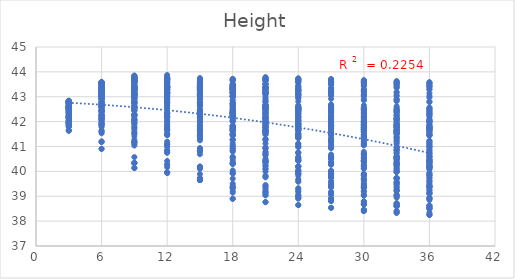
| Category | UTCI |
|---|---|
| 3.0 | 41.801 |
| 3.0 | 42.354 |
| 3.0 | 42.436 |
| 3.0 | 42.552 |
| 3.0 | 42.621 |
| 3.0 | 42.715 |
| 3.0 | 42.77 |
| 3.0 | 42.775 |
| 3.0 | 42.787 |
| 3.0 | 42.786 |
| 3.0 | 42.8 |
| 6.0 | 40.906 |
| 6.0 | 41.915 |
| 6.0 | 42.115 |
| 6.0 | 42.474 |
| 6.0 | 42.911 |
| 6.0 | 43.022 |
| 6.0 | 43.104 |
| 6.0 | 43.135 |
| 6.0 | 43.232 |
| 6.0 | 43.233 |
| 6.0 | 43.259 |
| 9.0 | 40.328 |
| 9.0 | 41.163 |
| 9.0 | 41.752 |
| 9.0 | 42.249 |
| 9.0 | 42.954 |
| 9.0 | 43.087 |
| 9.0 | 43.181 |
| 9.0 | 43.562 |
| 9.0 | 43.586 |
| 9.0 | 43.605 |
| 9.0 | 43.638 |
| 12.0 | 39.941 |
| 12.0 | 40.753 |
| 12.0 | 41.462 |
| 12.0 | 41.677 |
| 12.0 | 42.173 |
| 12.0 | 42.326 |
| 12.0 | 42.743 |
| 12.0 | 43.111 |
| 12.0 | 43.162 |
| 12.0 | 43.194 |
| 12.0 | 43.397 |
| 15.0 | 39.65 |
| 15.0 | 40.148 |
| 15.0 | 40.839 |
| 15.0 | 41.442 |
| 15.0 | 41.636 |
| 15.0 | 41.829 |
| 15.0 | 42.291 |
| 15.0 | 42.379 |
| 15.0 | 42.444 |
| 15.0 | 42.779 |
| 15.0 | 43.118 |
| 18.0 | 38.899 |
| 18.0 | 39.919 |
| 18.0 | 40.321 |
| 18.0 | 40.58 |
| 18.0 | 41.447 |
| 18.0 | 41.664 |
| 18.0 | 41.808 |
| 18.0 | 42.223 |
| 18.0 | 42.318 |
| 18.0 | 42.383 |
| 18.0 | 42.71 |
| 21.0 | 38.765 |
| 21.0 | 39.451 |
| 21.0 | 40.1 |
| 21.0 | 40.396 |
| 21.0 | 41.278 |
| 21.0 | 41.495 |
| 21.0 | 41.667 |
| 21.0 | 41.762 |
| 21.0 | 42.188 |
| 21.0 | 42.239 |
| 21.0 | 42.303 |
| 24.0 | 38.645 |
| 24.0 | 39.325 |
| 24.0 | 39.914 |
| 24.0 | 40.198 |
| 24.0 | 40.457 |
| 24.0 | 41.036 |
| 24.0 | 41.522 |
| 24.0 | 41.642 |
| 24.0 | 41.741 |
| 24.0 | 41.837 |
| 24.0 | 42.202 |
| 27.0 | 38.536 |
| 27.0 | 39.177 |
| 27.0 | 39.746 |
| 27.0 | 40.015 |
| 27.0 | 40.269 |
| 27.0 | 40.516 |
| 27.0 | 41.062 |
| 27.0 | 41.508 |
| 27.0 | 41.613 |
| 27.0 | 41.707 |
| 27.0 | 41.798 |
| 30.0 | 38.405 |
| 30.0 | 39.055 |
| 30.0 | 39.37 |
| 30.0 | 39.889 |
| 30.0 | 40.124 |
| 30.0 | 40.391 |
| 30.0 | 40.571 |
| 30.0 | 41.369 |
| 30.0 | 41.492 |
| 30.0 | 41.584 |
| 30.0 | 41.675 |
| 33.0 | 38.334 |
| 33.0 | 38.674 |
| 33.0 | 39.249 |
| 33.0 | 39.739 |
| 33.0 | 39.994 |
| 33.0 | 40.232 |
| 33.0 | 40.455 |
| 33.0 | 40.588 |
| 33.0 | 41.375 |
| 33.0 | 41.482 |
| 33.0 | 41.572 |
| 36.0 | 38.247 |
| 36.0 | 38.587 |
| 36.0 | 39.146 |
| 36.0 | 39.629 |
| 36.0 | 39.843 |
| 36.0 | 40.092 |
| 36.0 | 40.321 |
| 36.0 | 40.488 |
| 36.0 | 40.587 |
| 36.0 | 41.068 |
| 36.0 | 41.473 |
| 3.0 | 41.948 |
| 3.0 | 42.397 |
| 3.0 | 42.508 |
| 3.0 | 42.576 |
| 3.0 | 42.635 |
| 3.0 | 42.716 |
| 3.0 | 42.768 |
| 3.0 | 42.78 |
| 3.0 | 42.79 |
| 3.0 | 42.791 |
| 3.0 | 42.802 |
| 6.0 | 41.188 |
| 6.0 | 41.885 |
| 6.0 | 42.396 |
| 6.0 | 42.662 |
| 6.0 | 43.052 |
| 6.0 | 43.035 |
| 6.0 | 43.461 |
| 6.0 | 43.497 |
| 6.0 | 43.513 |
| 6.0 | 43.521 |
| 6.0 | 43.545 |
| 9.0 | 40.34 |
| 9.0 | 41.174 |
| 9.0 | 42.086 |
| 9.0 | 42.274 |
| 9.0 | 42.68 |
| 9.0 | 43.098 |
| 9.0 | 43.359 |
| 9.0 | 43.41 |
| 9.0 | 43.597 |
| 9.0 | 43.621 |
| 9.0 | 43.643 |
| 12.0 | 39.96 |
| 12.0 | 40.841 |
| 12.0 | 41.474 |
| 12.0 | 42.02 |
| 12.0 | 42.2 |
| 12.0 | 42.35 |
| 12.0 | 42.751 |
| 12.0 | 43.114 |
| 12.0 | 43.17 |
| 12.0 | 43.367 |
| 12.0 | 43.401 |
| 15.0 | 39.649 |
| 15.0 | 40.188 |
| 15.0 | 40.866 |
| 15.0 | 41.471 |
| 15.0 | 41.679 |
| 15.0 | 42.147 |
| 15.0 | 42.301 |
| 15.0 | 42.398 |
| 15.0 | 42.733 |
| 15.0 | 43.085 |
| 15.0 | 43.136 |
| 18.0 | 39.145 |
| 18.0 | 39.947 |
| 18.0 | 40.329 |
| 18.0 | 41.274 |
| 18.0 | 41.482 |
| 18.0 | 41.686 |
| 18.0 | 41.832 |
| 18.0 | 42.239 |
| 18.0 | 42.327 |
| 18.0 | 42.399 |
| 18.0 | 42.72 |
| 21.0 | 39.038 |
| 21.0 | 39.991 |
| 21.0 | 40.379 |
| 21.0 | 40.681 |
| 21.0 | 41.594 |
| 21.0 | 41.78 |
| 21.0 | 41.959 |
| 21.0 | 42.36 |
| 21.0 | 42.46 |
| 21.0 | 42.519 |
| 21.0 | 42.605 |
| 24.0 | 38.906 |
| 24.0 | 39.582 |
| 24.0 | 40.195 |
| 24.0 | 40.5 |
| 24.0 | 41.117 |
| 24.0 | 41.335 |
| 24.0 | 41.808 |
| 24.0 | 41.928 |
| 24.0 | 42.032 |
| 24.0 | 42.427 |
| 24.0 | 42.495 |
| 27.0 | 38.804 |
| 27.0 | 39.436 |
| 27.0 | 39.756 |
| 27.0 | 40.31 |
| 27.0 | 40.595 |
| 27.0 | 41.162 |
| 27.0 | 41.361 |
| 27.0 | 41.791 |
| 27.0 | 41.89 |
| 27.0 | 41.994 |
| 27.0 | 42.091 |
| 30.0 | 38.681 |
| 30.0 | 39.056 |
| 30.0 | 39.596 |
| 30.0 | 40.187 |
| 30.0 | 40.439 |
| 30.0 | 40.664 |
| 30.0 | 41.221 |
| 30.0 | 41.661 |
| 30.0 | 41.773 |
| 30.0 | 41.877 |
| 30.0 | 41.974 |
| 33.0 | 38.605 |
| 33.0 | 38.942 |
| 33.0 | 39.472 |
| 33.0 | 40.037 |
| 33.0 | 40.297 |
| 33.0 | 40.518 |
| 33.0 | 40.727 |
| 33.0 | 40.874 |
| 33.0 | 41.66 |
| 33.0 | 41.768 |
| 33.0 | 41.874 |
| 36.0 | 38.505 |
| 36.0 | 38.845 |
| 36.0 | 39.38 |
| 36.0 | 39.916 |
| 36.0 | 40.168 |
| 36.0 | 40.366 |
| 36.0 | 40.599 |
| 36.0 | 40.763 |
| 36.0 | 41.234 |
| 36.0 | 41.659 |
| 36.0 | 41.762 |
| 3.0 | 41.962 |
| 3.0 | 42.174 |
| 3.0 | 42.522 |
| 3.0 | 42.381 |
| 3.0 | 42.655 |
| 3.0 | 42.726 |
| 3.0 | 42.787 |
| 3.0 | 42.792 |
| 3.0 | 42.803 |
| 3.0 | 42.805 |
| 3.0 | 42.815 |
| 6.0 | 41.531 |
| 6.0 | 41.976 |
| 6.0 | 42.713 |
| 6.0 | 42.971 |
| 6.0 | 43.244 |
| 6.0 | 43.341 |
| 6.0 | 43.494 |
| 6.0 | 43.517 |
| 6.0 | 43.533 |
| 6.0 | 43.545 |
| 6.0 | 43.569 |
| 9.0 | 40.141 |
| 9.0 | 41.595 |
| 9.0 | 41.862 |
| 9.0 | 42.054 |
| 9.0 | 42.767 |
| 9.0 | 42.871 |
| 9.0 | 43.137 |
| 9.0 | 43.338 |
| 9.0 | 43.366 |
| 9.0 | 43.383 |
| 9.0 | 43.482 |
| 12.0 | 40.286 |
| 12.0 | 41.111 |
| 12.0 | 41.81 |
| 12.0 | 42.347 |
| 12.0 | 42.537 |
| 12.0 | 42.97 |
| 12.0 | 43.374 |
| 12.0 | 43.588 |
| 12.0 | 43.648 |
| 12.0 | 43.69 |
| 12.0 | 43.714 |
| 15.0 | 39.702 |
| 15.0 | 40.81 |
| 15.0 | 41.56 |
| 15.0 | 41.809 |
| 15.0 | 42.312 |
| 15.0 | 42.487 |
| 15.0 | 42.631 |
| 15.0 | 43.302 |
| 15.0 | 43.363 |
| 15.0 | 43.401 |
| 15.0 | 43.613 |
| 18.0 | 39.431 |
| 18.0 | 40.292 |
| 18.0 | 40.956 |
| 18.0 | 41.61 |
| 18.0 | 41.827 |
| 18.0 | 42.321 |
| 18.0 | 42.483 |
| 18.0 | 42.572 |
| 18.0 | 42.646 |
| 18.0 | 43.023 |
| 18.0 | 43.355 |
| 21.0 | 39.301 |
| 21.0 | 39.8 |
| 21.0 | 40.433 |
| 21.0 | 40.777 |
| 21.0 | 41.662 |
| 21.0 | 42.171 |
| 21.0 | 42.032 |
| 21.0 | 42.435 |
| 21.0 | 42.532 |
| 21.0 | 42.595 |
| 21.0 | 42.659 |
| 24.0 | 39.176 |
| 24.0 | 39.903 |
| 24.0 | 39.999 |
| 24.0 | 40.573 |
| 24.0 | 41.495 |
| 24.0 | 41.713 |
| 24.0 | 41.898 |
| 24.0 | 42.301 |
| 24.0 | 42.41 |
| 24.0 | 42.505 |
| 24.0 | 42.565 |
| 27.0 | 39.07 |
| 27.0 | 39.46 |
| 27.0 | 39.838 |
| 27.0 | 40.377 |
| 27.0 | 40.978 |
| 27.0 | 41.253 |
| 27.0 | 41.745 |
| 27.0 | 41.876 |
| 27.0 | 42.277 |
| 27.0 | 42.374 |
| 27.0 | 42.482 |
| 30.0 | 38.455 |
| 30.0 | 39.347 |
| 30.0 | 39.673 |
| 30.0 | 40.279 |
| 30.0 | 40.519 |
| 30.0 | 41.066 |
| 30.0 | 41.319 |
| 30.0 | 41.749 |
| 30.0 | 41.855 |
| 30.0 | 41.949 |
| 30.0 | 42.358 |
| 33.0 | 38.386 |
| 33.0 | 38.987 |
| 33.0 | 39.534 |
| 33.0 | 40.136 |
| 33.0 | 40.368 |
| 33.0 | 40.6 |
| 33.0 | 40.836 |
| 33.0 | 41.62 |
| 33.0 | 41.757 |
| 33.0 | 41.852 |
| 33.0 | 42.255 |
| 36.0 | 38.29 |
| 36.0 | 38.889 |
| 36.0 | 39.42 |
| 36.0 | 39.737 |
| 36.0 | 40.263 |
| 36.0 | 40.46 |
| 36.0 | 40.703 |
| 36.0 | 40.858 |
| 36.0 | 41.622 |
| 36.0 | 41.753 |
| 36.0 | 41.861 |
| 3.0 | 42.032 |
| 3.0 | 42.239 |
| 3.0 | 42.333 |
| 3.0 | 42.405 |
| 3.0 | 42.465 |
| 3.0 | 42.544 |
| 3.0 | 42.596 |
| 3.0 | 42.607 |
| 3.0 | 42.611 |
| 3.0 | 42.611 |
| 3.0 | 42.623 |
| 6.0 | 41.637 |
| 6.0 | 42.156 |
| 6.0 | 42.93 |
| 6.0 | 42.973 |
| 6.0 | 43.355 |
| 6.0 | 43.174 |
| 6.0 | 43.53 |
| 6.0 | 43.555 |
| 6.0 | 43.573 |
| 6.0 | 43.58 |
| 6.0 | 43.598 |
| 9.0 | 41.201 |
| 9.0 | 41.951 |
| 9.0 | 42.531 |
| 9.0 | 43.14 |
| 9.0 | 43.265 |
| 9.0 | 43.456 |
| 9.0 | 43.698 |
| 9.0 | 43.736 |
| 9.0 | 43.758 |
| 9.0 | 43.775 |
| 9.0 | 43.793 |
| 12.0 | 40.169 |
| 12.0 | 41.068 |
| 12.0 | 41.973 |
| 12.0 | 42.201 |
| 12.0 | 42.801 |
| 12.0 | 43.25 |
| 12.0 | 43.36 |
| 12.0 | 43.415 |
| 12.0 | 43.454 |
| 12.0 | 43.548 |
| 12.0 | 43.73 |
| 15.0 | 39.892 |
| 15.0 | 40.79 |
| 15.0 | 41.749 |
| 15.0 | 41.984 |
| 15.0 | 42.186 |
| 15.0 | 42.627 |
| 15.0 | 43.043 |
| 15.0 | 43.306 |
| 15.0 | 43.345 |
| 15.0 | 43.388 |
| 15.0 | 43.424 |
| 18.0 | 39.363 |
| 18.0 | 40.528 |
| 18.0 | 40.863 |
| 18.0 | 41.811 |
| 18.0 | 42.003 |
| 18.0 | 42.219 |
| 18.0 | 42.338 |
| 18.0 | 42.998 |
| 18.0 | 43.24 |
| 18.0 | 43.308 |
| 18.0 | 43.333 |
| 21.0 | 39.19 |
| 21.0 | 40.229 |
| 21.0 | 40.913 |
| 21.0 | 41.586 |
| 21.0 | 42.127 |
| 21.0 | 42.325 |
| 21.0 | 42.49 |
| 21.0 | 42.569 |
| 21.0 | 42.649 |
| 21.0 | 43.143 |
| 21.0 | 43.508 |
| 24.0 | 39.032 |
| 24.0 | 40.065 |
| 24.0 | 40.424 |
| 24.0 | 41.412 |
| 24.0 | 41.659 |
| 24.0 | 41.874 |
| 24.0 | 42.346 |
| 24.0 | 42.457 |
| 24.0 | 42.547 |
| 24.0 | 42.625 |
| 24.0 | 42.958 |
| 27.0 | 38.918 |
| 27.0 | 39.907 |
| 27.0 | 40 |
| 27.0 | 40.56 |
| 27.0 | 41.504 |
| 27.0 | 41.73 |
| 27.0 | 42.216 |
| 27.0 | 42.345 |
| 27.0 | 42.435 |
| 27.0 | 42.528 |
| 27.0 | 42.607 |
| 30.0 | 38.795 |
| 30.0 | 39.487 |
| 30.0 | 39.856 |
| 30.0 | 40.426 |
| 30.0 | 40.708 |
| 30.0 | 41.606 |
| 30.0 | 41.782 |
| 30.0 | 42.223 |
| 30.0 | 42.328 |
| 30.0 | 42.424 |
| 30.0 | 42.514 |
| 33.0 | 38.722 |
| 33.0 | 39.35 |
| 33.0 | 39.722 |
| 33.0 | 40.289 |
| 33.0 | 40.548 |
| 33.0 | 41.168 |
| 33.0 | 41.666 |
| 33.0 | 42.11 |
| 33.0 | 42.228 |
| 33.0 | 42.331 |
| 33.0 | 42.419 |
| 36.0 | 38.63 |
| 36.0 | 39.233 |
| 36.0 | 39.361 |
| 36.0 | 40.18 |
| 36.0 | 40.409 |
| 36.0 | 41.017 |
| 36.0 | 41.543 |
| 36.0 | 41.704 |
| 36.0 | 42.108 |
| 36.0 | 42.226 |
| 36.0 | 42.325 |
| 3.0 | 42.021 |
| 3.0 | 41.854 |
| 3.0 | 42.279 |
| 3.0 | 41.96 |
| 3.0 | 42.429 |
| 3.0 | 42.481 |
| 3.0 | 42.537 |
| 3.0 | 42.539 |
| 3.0 | 42.54 |
| 3.0 | 42.541 |
| 3.0 | 42.558 |
| 6.0 | 42.246 |
| 6.0 | 42.128 |
| 6.0 | 42.243 |
| 6.0 | 43.008 |
| 6.0 | 43.16 |
| 6.0 | 43.231 |
| 6.0 | 43.306 |
| 6.0 | 43.325 |
| 6.0 | 43.341 |
| 6.0 | 43.337 |
| 6.0 | 43.357 |
| 9.0 | 41.037 |
| 9.0 | 42.44 |
| 9.0 | 43.132 |
| 9.0 | 43.302 |
| 9.0 | 43.411 |
| 9.0 | 43.541 |
| 9.0 | 43.776 |
| 9.0 | 43.81 |
| 9.0 | 43.834 |
| 9.0 | 43.835 |
| 9.0 | 43.855 |
| 12.0 | 40.417 |
| 12.0 | 41.894 |
| 12.0 | 42.3 |
| 12.0 | 43.118 |
| 12.0 | 43.288 |
| 12.0 | 43.435 |
| 12.0 | 43.548 |
| 12.0 | 43.747 |
| 12.0 | 43.772 |
| 12.0 | 43.786 |
| 12.0 | 43.808 |
| 15.0 | 40.137 |
| 15.0 | 41.63 |
| 15.0 | 41.946 |
| 15.0 | 42.315 |
| 15.0 | 43.13 |
| 15.0 | 43.31 |
| 15.0 | 43.438 |
| 15.0 | 43.506 |
| 15.0 | 43.537 |
| 15.0 | 43.563 |
| 15.0 | 43.753 |
| 18.0 | 39.323 |
| 18.0 | 41.051 |
| 18.0 | 41.777 |
| 18.0 | 42.005 |
| 18.0 | 42.357 |
| 18.0 | 43.212 |
| 18.0 | 43.318 |
| 18.0 | 43.402 |
| 18.0 | 43.463 |
| 18.0 | 43.501 |
| 18.0 | 43.519 |
| 21.0 | 39.143 |
| 21.0 | 40.299 |
| 21.0 | 41.591 |
| 21.0 | 41.86 |
| 21.0 | 42.116 |
| 21.0 | 42.807 |
| 21.0 | 43.251 |
| 21.0 | 43.296 |
| 21.0 | 43.373 |
| 21.0 | 43.404 |
| 21.0 | 43.45 |
| 24.0 | 38.979 |
| 24.0 | 39.822 |
| 24.0 | 41.41 |
| 24.0 | 41.71 |
| 24.0 | 41.948 |
| 24.0 | 42.399 |
| 24.0 | 42.57 |
| 24.0 | 43.231 |
| 24.0 | 43.286 |
| 24.0 | 43.342 |
| 24.0 | 43.378 |
| 27.0 | 38.855 |
| 27.0 | 39.364 |
| 27.0 | 40.929 |
| 27.0 | 41.538 |
| 27.0 | 41.84 |
| 27.0 | 42.114 |
| 27.0 | 42.453 |
| 27.0 | 42.567 |
| 27.0 | 43.206 |
| 27.0 | 43.263 |
| 27.0 | 43.319 |
| 30.0 | 38.704 |
| 30.0 | 39.212 |
| 30.0 | 39.894 |
| 30.0 | 41.426 |
| 30.0 | 41.711 |
| 30.0 | 42.02 |
| 30.0 | 42.2 |
| 30.0 | 42.467 |
| 30.0 | 42.55 |
| 30.0 | 42.896 |
| 30.0 | 43.247 |
| 33.0 | 38.613 |
| 33.0 | 39.059 |
| 33.0 | 39.451 |
| 33.0 | 40.962 |
| 33.0 | 41.551 |
| 33.0 | 41.895 |
| 33.0 | 42.104 |
| 33.0 | 42.377 |
| 33.0 | 42.477 |
| 33.0 | 42.551 |
| 33.0 | 42.901 |
| 36.0 | 38.501 |
| 36.0 | 38.943 |
| 36.0 | 39.346 |
| 36.0 | 40.203 |
| 36.0 | 41.454 |
| 36.0 | 41.771 |
| 36.0 | 41.994 |
| 36.0 | 42.298 |
| 36.0 | 42.366 |
| 36.0 | 42.46 |
| 36.0 | 42.546 |
| 3.0 | 41.661 |
| 3.0 | 41.851 |
| 3.0 | 41.919 |
| 3.0 | 41.981 |
| 3.0 | 42.038 |
| 3.0 | 42.123 |
| 3.0 | 42.17 |
| 3.0 | 42.17 |
| 3.0 | 42.17 |
| 3.0 | 42.173 |
| 3.0 | 42.185 |
| 6.0 | 41.864 |
| 6.0 | 42.043 |
| 6.0 | 42.437 |
| 6.0 | 42.237 |
| 6.0 | 42.602 |
| 6.0 | 42.426 |
| 6.0 | 42.763 |
| 6.0 | 42.778 |
| 6.0 | 42.791 |
| 6.0 | 42.786 |
| 6.0 | 42.797 |
| 9.0 | 41.941 |
| 9.0 | 42.294 |
| 9.0 | 42.639 |
| 9.0 | 42.763 |
| 9.0 | 42.863 |
| 9.0 | 42.962 |
| 9.0 | 43.027 |
| 9.0 | 43.058 |
| 9.0 | 43.065 |
| 9.0 | 43.068 |
| 9.0 | 43.076 |
| 12.0 | 41.635 |
| 12.0 | 42.647 |
| 12.0 | 42.868 |
| 12.0 | 43.021 |
| 12.0 | 43.156 |
| 12.0 | 43.435 |
| 12.0 | 43.519 |
| 12.0 | 43.554 |
| 12.0 | 43.565 |
| 12.0 | 43.571 |
| 12.0 | 43.592 |
| 15.0 | 41.404 |
| 15.0 | 42.189 |
| 15.0 | 42.736 |
| 15.0 | 42.906 |
| 15.0 | 43.05 |
| 15.0 | 43.184 |
| 15.0 | 43.29 |
| 15.0 | 43.506 |
| 15.0 | 43.514 |
| 15.0 | 43.533 |
| 15.0 | 43.55 |
| 18.0 | 41.13 |
| 18.0 | 41.757 |
| 18.0 | 42.812 |
| 18.0 | 43.021 |
| 18.0 | 43.17 |
| 18.0 | 43.336 |
| 18.0 | 43.427 |
| 18.0 | 43.484 |
| 18.0 | 43.679 |
| 18.0 | 43.711 |
| 18.0 | 43.721 |
| 21.0 | 40.931 |
| 21.0 | 41.751 |
| 21.0 | 42.658 |
| 21.0 | 43.175 |
| 21.0 | 43.364 |
| 21.0 | 43.52 |
| 21.0 | 43.639 |
| 21.0 | 43.688 |
| 21.0 | 43.728 |
| 21.0 | 43.745 |
| 21.0 | 43.789 |
| 24.0 | 40.735 |
| 24.0 | 41.346 |
| 24.0 | 42.524 |
| 24.0 | 43.068 |
| 24.0 | 43.257 |
| 24.0 | 43.434 |
| 24.0 | 43.569 |
| 24.0 | 43.639 |
| 24.0 | 43.676 |
| 24.0 | 43.72 |
| 24.0 | 43.743 |
| 27.0 | 39.908 |
| 27.0 | 41.205 |
| 27.0 | 41.836 |
| 27.0 | 42.915 |
| 27.0 | 43.172 |
| 27.0 | 43.343 |
| 27.0 | 43.489 |
| 27.0 | 43.576 |
| 27.0 | 43.62 |
| 27.0 | 43.669 |
| 27.0 | 43.715 |
| 30.0 | 39.702 |
| 30.0 | 41.049 |
| 30.0 | 41.703 |
| 30.0 | 42.262 |
| 30.0 | 43.072 |
| 30.0 | 43.279 |
| 30.0 | 43.425 |
| 30.0 | 43.519 |
| 30.0 | 43.571 |
| 30.0 | 43.621 |
| 30.0 | 43.669 |
| 33.0 | 39.558 |
| 33.0 | 40.532 |
| 33.0 | 41.588 |
| 33.0 | 42.149 |
| 33.0 | 42.38 |
| 33.0 | 43.19 |
| 33.0 | 43.362 |
| 33.0 | 43.454 |
| 33.0 | 43.535 |
| 33.0 | 43.578 |
| 33.0 | 43.628 |
| 36.0 | 39.41 |
| 36.0 | 40.388 |
| 36.0 | 41.216 |
| 36.0 | 42.051 |
| 36.0 | 42.287 |
| 36.0 | 42.809 |
| 36.0 | 43.288 |
| 36.0 | 43.403 |
| 36.0 | 43.449 |
| 36.0 | 43.535 |
| 36.0 | 43.585 |
| 3.0 | 41.628 |
| 3.0 | 41.867 |
| 3.0 | 41.869 |
| 3.0 | 41.959 |
| 3.0 | 42.01 |
| 3.0 | 42.083 |
| 3.0 | 42.15 |
| 3.0 | 42.146 |
| 3.0 | 42.151 |
| 3.0 | 42.147 |
| 3.0 | 42.163 |
| 6.0 | 41.783 |
| 6.0 | 41.841 |
| 6.0 | 42.234 |
| 6.0 | 42.317 |
| 6.0 | 42.41 |
| 6.0 | 42.489 |
| 6.0 | 42.568 |
| 6.0 | 42.569 |
| 6.0 | 42.594 |
| 6.0 | 42.587 |
| 6.0 | 42.592 |
| 9.0 | 41.525 |
| 9.0 | 41.684 |
| 9.0 | 42.288 |
| 9.0 | 42.215 |
| 9.0 | 42.599 |
| 9.0 | 42.449 |
| 9.0 | 42.746 |
| 9.0 | 42.557 |
| 9.0 | 42.769 |
| 9.0 | 42.555 |
| 9.0 | 42.778 |
| 12.0 | 41.859 |
| 12.0 | 42.305 |
| 12.0 | 42.742 |
| 12.0 | 42.899 |
| 12.0 | 43.009 |
| 12.0 | 43.178 |
| 12.0 | 43.282 |
| 12.0 | 43.29 |
| 12.0 | 43.296 |
| 12.0 | 43.304 |
| 12.0 | 43.325 |
| 15.0 | 41.417 |
| 15.0 | 42.185 |
| 15.0 | 42.336 |
| 15.0 | 42.816 |
| 15.0 | 42.933 |
| 15.0 | 43.037 |
| 15.0 | 43.151 |
| 15.0 | 43.274 |
| 15.0 | 43.276 |
| 15.0 | 43.278 |
| 15.0 | 43.291 |
| 18.0 | 41.26 |
| 18.0 | 42.057 |
| 18.0 | 42.259 |
| 18.0 | 42.448 |
| 18.0 | 42.879 |
| 18.0 | 43.016 |
| 18.0 | 43.109 |
| 18.0 | 43.139 |
| 18.0 | 43.161 |
| 18.0 | 43.197 |
| 18.0 | 43.281 |
| 21.0 | 41.126 |
| 21.0 | 41.934 |
| 21.0 | 42.148 |
| 21.0 | 42.386 |
| 21.0 | 42.845 |
| 21.0 | 42.985 |
| 21.0 | 43.09 |
| 21.0 | 43.098 |
| 21.0 | 43.128 |
| 21.0 | 43.146 |
| 21.0 | 43.25 |
| 24.0 | 40.982 |
| 24.0 | 41.835 |
| 24.0 | 42.062 |
| 24.0 | 42.306 |
| 24.0 | 42.462 |
| 24.0 | 42.934 |
| 24.0 | 43.063 |
| 24.0 | 43.084 |
| 24.0 | 43.101 |
| 24.0 | 43.134 |
| 24.0 | 43.224 |
| 27.0 | 40.531 |
| 27.0 | 41.464 |
| 27.0 | 41.969 |
| 27.0 | 42.21 |
| 27.0 | 42.393 |
| 27.0 | 42.544 |
| 27.0 | 42.69 |
| 27.0 | 43.046 |
| 27.0 | 43.073 |
| 27.0 | 43.106 |
| 27.0 | 43.221 |
| 30.0 | 39.839 |
| 30.0 | 41.34 |
| 30.0 | 41.875 |
| 30.0 | 42.169 |
| 30.0 | 42.335 |
| 30.0 | 42.522 |
| 30.0 | 42.652 |
| 30.0 | 43.021 |
| 30.0 | 43.035 |
| 30.0 | 43.078 |
| 30.0 | 43.19 |
| 33.0 | 39.718 |
| 33.0 | 41.21 |
| 33.0 | 41.527 |
| 33.0 | 42.094 |
| 33.0 | 42.256 |
| 33.0 | 42.453 |
| 33.0 | 42.618 |
| 33.0 | 42.82 |
| 33.0 | 43.027 |
| 33.0 | 43.054 |
| 33.0 | 43.164 |
| 36.0 | 39.565 |
| 36.0 | 41.1 |
| 36.0 | 41.469 |
| 36.0 | 41.756 |
| 36.0 | 42.207 |
| 36.0 | 42.382 |
| 36.0 | 42.571 |
| 36.0 | 42.784 |
| 36.0 | 42.973 |
| 36.0 | 43.029 |
| 36.0 | 43.139 |
| 3.0 | 41.646 |
| 3.0 | 41.902 |
| 3.0 | 41.975 |
| 3.0 | 42.038 |
| 3.0 | 42.096 |
| 3.0 | 42.18 |
| 3.0 | 42.231 |
| 3.0 | 42.23 |
| 3.0 | 42.23 |
| 3.0 | 42.235 |
| 3.0 | 42.249 |
| 6.0 | 42.079 |
| 6.0 | 42.24 |
| 6.0 | 42.636 |
| 6.0 | 42.44 |
| 6.0 | 42.87 |
| 6.0 | 42.696 |
| 6.0 | 43.039 |
| 6.0 | 43.051 |
| 6.0 | 43.064 |
| 6.0 | 43.06 |
| 6.0 | 43.069 |
| 9.0 | 42.124 |
| 9.0 | 42.461 |
| 9.0 | 42.8 |
| 9.0 | 42.921 |
| 9.0 | 43.022 |
| 9.0 | 43.116 |
| 9.0 | 43.185 |
| 9.0 | 43.284 |
| 9.0 | 43.29 |
| 9.0 | 43.292 |
| 9.0 | 43.298 |
| 12.0 | 41.534 |
| 12.0 | 42.836 |
| 12.0 | 43.047 |
| 12.0 | 43.185 |
| 12.0 | 43.314 |
| 12.0 | 43.595 |
| 12.0 | 43.686 |
| 12.0 | 43.716 |
| 12.0 | 43.724 |
| 12.0 | 43.729 |
| 12.0 | 43.75 |
| 15.0 | 41.32 |
| 15.0 | 42.068 |
| 15.0 | 42.931 |
| 15.0 | 43.089 |
| 15.0 | 43.222 |
| 15.0 | 43.345 |
| 15.0 | 43.454 |
| 15.0 | 43.673 |
| 15.0 | 43.679 |
| 15.0 | 43.697 |
| 15.0 | 43.71 |
| 18.0 | 40.834 |
| 18.0 | 41.656 |
| 18.0 | 42.501 |
| 18.0 | 43.011 |
| 18.0 | 43.148 |
| 18.0 | 43.303 |
| 18.0 | 43.389 |
| 18.0 | 43.437 |
| 18.0 | 43.639 |
| 18.0 | 43.668 |
| 18.0 | 43.676 |
| 21.0 | 40.655 |
| 21.0 | 41.485 |
| 21.0 | 42.356 |
| 21.0 | 43.185 |
| 21.0 | 43.374 |
| 21.0 | 43.516 |
| 21.0 | 43.632 |
| 21.0 | 43.663 |
| 21.0 | 43.702 |
| 21.0 | 43.716 |
| 21.0 | 43.756 |
| 24.0 | 40.454 |
| 24.0 | 41.099 |
| 24.0 | 42.233 |
| 24.0 | 43.086 |
| 24.0 | 43.267 |
| 24.0 | 43.442 |
| 24.0 | 43.574 |
| 24.0 | 43.622 |
| 24.0 | 43.657 |
| 24.0 | 43.695 |
| 24.0 | 43.714 |
| 27.0 | 39.612 |
| 27.0 | 40.953 |
| 27.0 | 41.575 |
| 27.0 | 42.636 |
| 27.0 | 43.189 |
| 27.0 | 43.355 |
| 27.0 | 43.5 |
| 27.0 | 43.567 |
| 27.0 | 43.606 |
| 27.0 | 43.65 |
| 27.0 | 43.693 |
| 30.0 | 39.395 |
| 30.0 | 40.788 |
| 30.0 | 41.447 |
| 30.0 | 41.988 |
| 30.0 | 43.095 |
| 30.0 | 43.294 |
| 30.0 | 43.439 |
| 30.0 | 43.516 |
| 30.0 | 43.561 |
| 30.0 | 43.602 |
| 30.0 | 43.65 |
| 33.0 | 39.253 |
| 33.0 | 40.325 |
| 33.0 | 41.328 |
| 33.0 | 41.882 |
| 33.0 | 42.107 |
| 33.0 | 42.901 |
| 33.0 | 43.375 |
| 33.0 | 43.448 |
| 33.0 | 43.521 |
| 33.0 | 43.564 |
| 33.0 | 43.61 |
| 36.0 | 39.101 |
| 36.0 | 40.178 |
| 36.0 | 40.974 |
| 36.0 | 41.796 |
| 36.0 | 42.016 |
| 36.0 | 42.509 |
| 36.0 | 43.304 |
| 36.0 | 43.4 |
| 36.0 | 43.443 |
| 36.0 | 43.519 |
| 36.0 | 43.568 |
| 3.0 | 41.967 |
| 3.0 | 41.805 |
| 3.0 | 42.3 |
| 3.0 | 41.981 |
| 3.0 | 42.447 |
| 3.0 | 42.511 |
| 3.0 | 42.561 |
| 3.0 | 42.564 |
| 3.0 | 42.564 |
| 3.0 | 42.569 |
| 3.0 | 42.584 |
| 6.0 | 42.259 |
| 6.0 | 42.069 |
| 6.0 | 42.732 |
| 6.0 | 42.945 |
| 6.0 | 43.089 |
| 6.0 | 43.179 |
| 6.0 | 43.239 |
| 6.0 | 43.335 |
| 6.0 | 43.35 |
| 6.0 | 43.347 |
| 6.0 | 43.366 |
| 9.0 | 41.421 |
| 9.0 | 42.605 |
| 9.0 | 43.095 |
| 9.0 | 43.224 |
| 9.0 | 43.325 |
| 9.0 | 43.468 |
| 9.0 | 43.702 |
| 9.0 | 43.736 |
| 9.0 | 43.76 |
| 9.0 | 43.757 |
| 9.0 | 43.776 |
| 12.0 | 41.068 |
| 12.0 | 42.078 |
| 12.0 | 42.632 |
| 12.0 | 43.058 |
| 12.0 | 43.216 |
| 12.0 | 43.369 |
| 12.0 | 43.469 |
| 12.0 | 43.676 |
| 12.0 | 43.7 |
| 12.0 | 43.714 |
| 12.0 | 43.74 |
| 15.0 | 40.102 |
| 15.0 | 41.345 |
| 15.0 | 42.153 |
| 15.0 | 42.327 |
| 15.0 | 43.07 |
| 15.0 | 43.257 |
| 15.0 | 43.376 |
| 15.0 | 43.433 |
| 15.0 | 43.459 |
| 15.0 | 43.489 |
| 15.0 | 43.514 |
| 18.0 | 39.333 |
| 18.0 | 40.793 |
| 18.0 | 41.508 |
| 18.0 | 41.724 |
| 18.0 | 42.367 |
| 18.0 | 43.166 |
| 18.0 | 43.269 |
| 18.0 | 43.339 |
| 18.0 | 43.395 |
| 18.0 | 43.431 |
| 18.0 | 43.448 |
| 21.0 | 39.128 |
| 21.0 | 40.515 |
| 21.0 | 41.308 |
| 21.0 | 41.587 |
| 21.0 | 41.954 |
| 21.0 | 42.772 |
| 21.0 | 42.918 |
| 21.0 | 43.244 |
| 21.0 | 43.313 |
| 21.0 | 43.343 |
| 21.0 | 43.379 |
| 24.0 | 38.958 |
| 24.0 | 39.899 |
| 24.0 | 40.752 |
| 24.0 | 41.43 |
| 24.0 | 41.672 |
| 24.0 | 42.361 |
| 24.0 | 42.815 |
| 24.0 | 43.18 |
| 24.0 | 43.234 |
| 24.0 | 43.289 |
| 24.0 | 43.321 |
| 27.0 | 38.827 |
| 27.0 | 39.364 |
| 27.0 | 40.583 |
| 27.0 | 41.25 |
| 27.0 | 41.532 |
| 27.0 | 41.777 |
| 27.0 | 42.102 |
| 27.0 | 42.516 |
| 27.0 | 43.156 |
| 27.0 | 43.215 |
| 27.0 | 43.266 |
| 30.0 | 38.669 |
| 30.0 | 39.187 |
| 30.0 | 40.407 |
| 30.0 | 41.127 |
| 30.0 | 41.408 |
| 30.0 | 41.692 |
| 30.0 | 41.859 |
| 30.0 | 42.118 |
| 30.0 | 42.502 |
| 30.0 | 42.86 |
| 30.0 | 43.198 |
| 33.0 | 38.588 |
| 33.0 | 39.04 |
| 33.0 | 39.973 |
| 33.0 | 40.972 |
| 33.0 | 41.264 |
| 33.0 | 41.561 |
| 33.0 | 41.777 |
| 33.0 | 42.037 |
| 33.0 | 42.439 |
| 33.0 | 42.504 |
| 33.0 | 42.857 |
| 36.0 | 38.493 |
| 36.0 | 38.919 |
| 36.0 | 39.855 |
| 36.0 | 40.196 |
| 36.0 | 41.135 |
| 36.0 | 41.433 |
| 36.0 | 41.664 |
| 36.0 | 41.964 |
| 36.0 | 42.028 |
| 36.0 | 42.425 |
| 36.0 | 42.5 |
| 3.0 | 41.902 |
| 3.0 | 42.394 |
| 3.0 | 42.545 |
| 3.0 | 42.618 |
| 3.0 | 42.678 |
| 3.0 | 42.767 |
| 3.0 | 42.811 |
| 3.0 | 42.822 |
| 3.0 | 42.825 |
| 3.0 | 42.831 |
| 3.0 | 42.844 |
| 6.0 | 41.631 |
| 6.0 | 42.196 |
| 6.0 | 42.899 |
| 6.0 | 42.908 |
| 6.0 | 43.275 |
| 6.0 | 43.12 |
| 6.0 | 43.45 |
| 6.0 | 43.546 |
| 6.0 | 43.564 |
| 6.0 | 43.572 |
| 6.0 | 43.587 |
| 9.0 | 40.574 |
| 9.0 | 41.965 |
| 9.0 | 42.501 |
| 9.0 | 43.131 |
| 9.0 | 43.261 |
| 9.0 | 43.377 |
| 9.0 | 43.62 |
| 9.0 | 43.66 |
| 9.0 | 43.681 |
| 9.0 | 43.699 |
| 9.0 | 43.715 |
| 12.0 | 39.951 |
| 12.0 | 40.976 |
| 12.0 | 41.662 |
| 12.0 | 42.191 |
| 12.0 | 42.942 |
| 12.0 | 43.25 |
| 12.0 | 43.349 |
| 12.0 | 43.403 |
| 12.0 | 43.438 |
| 12.0 | 43.462 |
| 12.0 | 43.658 |
| 15.0 | 39.656 |
| 15.0 | 40.69 |
| 15.0 | 41.427 |
| 15.0 | 41.676 |
| 15.0 | 42.183 |
| 15.0 | 42.647 |
| 15.0 | 43.05 |
| 15.0 | 43.303 |
| 15.0 | 43.338 |
| 15.0 | 43.379 |
| 15.0 | 43.41 |
| 18.0 | 39.353 |
| 18.0 | 40.438 |
| 18.0 | 40.916 |
| 18.0 | 41.497 |
| 18.0 | 41.703 |
| 18.0 | 42.223 |
| 18.0 | 42.342 |
| 18.0 | 43.008 |
| 18.0 | 43.243 |
| 18.0 | 43.307 |
| 18.0 | 43.332 |
| 21.0 | 39.209 |
| 21.0 | 40.192 |
| 21.0 | 40.97 |
| 21.0 | 41.578 |
| 21.0 | 41.842 |
| 21.0 | 42.048 |
| 21.0 | 42.514 |
| 21.0 | 42.591 |
| 21.0 | 42.673 |
| 21.0 | 43.179 |
| 21.0 | 43.53 |
| 24.0 | 39.058 |
| 24.0 | 40.009 |
| 24.0 | 40.426 |
| 24.0 | 41.411 |
| 24.0 | 41.651 |
| 24.0 | 41.903 |
| 24.0 | 42.071 |
| 24.0 | 42.177 |
| 24.0 | 42.567 |
| 24.0 | 42.652 |
| 24.0 | 42.998 |
| 27.0 | 38.926 |
| 27.0 | 39.876 |
| 27.0 | 40.009 |
| 27.0 | 40.544 |
| 27.0 | 41.511 |
| 27.0 | 41.737 |
| 27.0 | 41.945 |
| 27.0 | 42.072 |
| 27.0 | 42.155 |
| 27.0 | 42.556 |
| 27.0 | 42.636 |
| 30.0 | 38.789 |
| 30.0 | 39.494 |
| 30.0 | 39.846 |
| 30.0 | 40.422 |
| 30.0 | 40.703 |
| 30.0 | 41.609 |
| 30.0 | 41.795 |
| 30.0 | 41.959 |
| 30.0 | 42.057 |
| 30.0 | 42.46 |
| 30.0 | 42.543 |
| 33.0 | 38.702 |
| 33.0 | 39.362 |
| 33.0 | 39.708 |
| 33.0 | 40.273 |
| 33.0 | 40.534 |
| 33.0 | 41.109 |
| 33.0 | 41.675 |
| 33.0 | 41.836 |
| 33.0 | 41.967 |
| 33.0 | 42.064 |
| 33.0 | 42.151 |
| 36.0 | 38.622 |
| 36.0 | 39.251 |
| 36.0 | 39.371 |
| 36.0 | 40.149 |
| 36.0 | 40.406 |
| 36.0 | 40.951 |
| 36.0 | 41.56 |
| 36.0 | 41.723 |
| 36.0 | 41.833 |
| 36.0 | 41.969 |
| 36.0 | 42.063 |
| 3.0 | 41.959 |
| 3.0 | 42.368 |
| 3.0 | 42.498 |
| 3.0 | 42.595 |
| 3.0 | 42.658 |
| 3.0 | 42.73 |
| 3.0 | 42.791 |
| 3.0 | 42.796 |
| 3.0 | 42.807 |
| 3.0 | 42.809 |
| 3.0 | 42.818 |
| 6.0 | 41.208 |
| 6.0 | 41.946 |
| 6.0 | 42.674 |
| 6.0 | 42.946 |
| 6.0 | 43.23 |
| 6.0 | 43.33 |
| 6.0 | 43.411 |
| 6.0 | 43.434 |
| 6.0 | 43.522 |
| 6.0 | 43.534 |
| 6.0 | 43.556 |
| 9.0 | 40.132 |
| 9.0 | 41.281 |
| 9.0 | 41.525 |
| 9.0 | 42.039 |
| 9.0 | 42.761 |
| 9.0 | 43.017 |
| 9.0 | 43.113 |
| 9.0 | 43.325 |
| 9.0 | 43.355 |
| 9.0 | 43.373 |
| 9.0 | 43.399 |
| 12.0 | 40.278 |
| 12.0 | 41.196 |
| 12.0 | 41.781 |
| 12.0 | 42.354 |
| 12.0 | 42.537 |
| 12.0 | 42.984 |
| 12.0 | 43.388 |
| 12.0 | 43.589 |
| 12.0 | 43.643 |
| 12.0 | 43.685 |
| 12.0 | 43.875 |
| 15.0 | 39.731 |
| 15.0 | 40.902 |
| 15.0 | 41.247 |
| 15.0 | 41.81 |
| 15.0 | 42.018 |
| 15.0 | 42.492 |
| 15.0 | 42.634 |
| 15.0 | 43.316 |
| 15.0 | 43.375 |
| 15.0 | 43.57 |
| 15.0 | 43.452 |
| 18.0 | 39.509 |
| 18.0 | 40.037 |
| 18.0 | 41.015 |
| 18.0 | 41.613 |
| 18.0 | 41.83 |
| 18.0 | 42.034 |
| 18.0 | 42.487 |
| 18.0 | 42.574 |
| 18.0 | 42.653 |
| 18.0 | 43.04 |
| 18.0 | 43.366 |
| 21.0 | 39.353 |
| 21.0 | 39.824 |
| 21.0 | 40.44 |
| 21.0 | 40.779 |
| 21.0 | 41.667 |
| 21.0 | 41.874 |
| 21.0 | 42.05 |
| 21.0 | 42.137 |
| 21.0 | 42.53 |
| 21.0 | 42.605 |
| 21.0 | 42.668 |
| 24.0 | 39.209 |
| 24.0 | 39.683 |
| 24.0 | 40.008 |
| 24.0 | 40.58 |
| 24.0 | 41.496 |
| 24.0 | 41.711 |
| 24.0 | 41.896 |
| 24.0 | 42.014 |
| 24.0 | 42.115 |
| 24.0 | 42.514 |
| 24.0 | 42.565 |
| 27.0 | 39.078 |
| 27.0 | 39.547 |
| 27.0 | 39.855 |
| 27.0 | 40.385 |
| 27.0 | 40.678 |
| 27.0 | 41.185 |
| 27.0 | 41.743 |
| 27.0 | 41.88 |
| 27.0 | 41.986 |
| 27.0 | 42.089 |
| 27.0 | 42.182 |
| 30.0 | 38.455 |
| 30.0 | 39.413 |
| 30.0 | 39.704 |
| 30.0 | 40.264 |
| 30.0 | 40.53 |
| 30.0 | 41.066 |
| 30.0 | 41.322 |
| 30.0 | 41.75 |
| 30.0 | 41.858 |
| 30.0 | 41.978 |
| 30.0 | 42.07 |
| 33.0 | 38.411 |
| 33.0 | 39.034 |
| 33.0 | 39.589 |
| 33.0 | 40.123 |
| 33.0 | 40.371 |
| 33.0 | 40.61 |
| 33.0 | 40.839 |
| 33.0 | 41.631 |
| 33.0 | 41.753 |
| 33.0 | 41.864 |
| 33.0 | 41.963 |
| 36.0 | 38.34 |
| 36.0 | 38.922 |
| 36.0 | 39.506 |
| 36.0 | 39.756 |
| 36.0 | 40.248 |
| 36.0 | 40.462 |
| 36.0 | 40.696 |
| 36.0 | 40.86 |
| 36.0 | 41.62 |
| 36.0 | 41.757 |
| 36.0 | 41.867 |
| 3.0 | 41.952 |
| 3.0 | 42.327 |
| 3.0 | 42.497 |
| 3.0 | 42.579 |
| 3.0 | 42.644 |
| 3.0 | 42.718 |
| 3.0 | 42.775 |
| 3.0 | 42.783 |
| 3.0 | 42.796 |
| 3.0 | 42.799 |
| 3.0 | 42.81 |
| 6.0 | 41.177 |
| 6.0 | 41.581 |
| 6.0 | 42.363 |
| 6.0 | 42.66 |
| 6.0 | 43.201 |
| 6.0 | 43.039 |
| 6.0 | 43.384 |
| 6.0 | 43.414 |
| 6.0 | 43.437 |
| 6.0 | 43.51 |
| 6.0 | 43.531 |
| 9.0 | 40.35 |
| 9.0 | 41.172 |
| 9.0 | 41.779 |
| 9.0 | 42.275 |
| 9.0 | 42.991 |
| 9.0 | 43.108 |
| 9.0 | 43.361 |
| 9.0 | 43.404 |
| 9.0 | 43.604 |
| 9.0 | 43.629 |
| 9.0 | 43.654 |
| 12.0 | 39.966 |
| 12.0 | 40.844 |
| 12.0 | 41.478 |
| 12.0 | 41.724 |
| 12.0 | 42.212 |
| 12.0 | 42.356 |
| 12.0 | 42.777 |
| 12.0 | 43.122 |
| 12.0 | 43.18 |
| 12.0 | 43.368 |
| 12.0 | 43.405 |
| 15.0 | 39.684 |
| 15.0 | 40.198 |
| 15.0 | 40.939 |
| 15.0 | 41.475 |
| 15.0 | 41.691 |
| 15.0 | 41.858 |
| 15.0 | 42.308 |
| 15.0 | 42.403 |
| 15.0 | 42.762 |
| 15.0 | 43.103 |
| 15.0 | 43.149 |
| 18.0 | 39.208 |
| 18.0 | 39.708 |
| 18.0 | 40.346 |
| 18.0 | 41.281 |
| 18.0 | 41.489 |
| 18.0 | 41.705 |
| 18.0 | 42.15 |
| 18.0 | 42.247 |
| 18.0 | 42.335 |
| 18.0 | 42.414 |
| 18.0 | 42.748 |
| 21.0 | 39.043 |
| 21.0 | 39.758 |
| 21.0 | 40.382 |
| 21.0 | 40.689 |
| 21.0 | 41.601 |
| 21.0 | 41.796 |
| 21.0 | 41.969 |
| 21.0 | 42.065 |
| 21.0 | 42.476 |
| 21.0 | 42.535 |
| 21.0 | 42.612 |
| 24.0 | 38.915 |
| 24.0 | 39.614 |
| 24.0 | 40.205 |
| 24.0 | 40.511 |
| 24.0 | 40.765 |
| 24.0 | 41.353 |
| 24.0 | 41.816 |
| 24.0 | 41.933 |
| 24.0 | 42.044 |
| 24.0 | 42.447 |
| 24.0 | 42.505 |
| 27.0 | 38.812 |
| 27.0 | 39.471 |
| 27.0 | 39.792 |
| 27.0 | 40.31 |
| 27.0 | 40.606 |
| 27.0 | 41.182 |
| 27.0 | 41.305 |
| 27.0 | 41.8 |
| 27.0 | 41.896 |
| 27.0 | 42.014 |
| 27.0 | 42.412 |
| 30.0 | 38.676 |
| 30.0 | 39.337 |
| 30.0 | 39.66 |
| 30.0 | 40.192 |
| 30.0 | 40.451 |
| 30.0 | 40.682 |
| 30.0 | 41.166 |
| 30.0 | 41.676 |
| 30.0 | 41.776 |
| 30.0 | 41.891 |
| 30.0 | 41.987 |
| 33.0 | 38.623 |
| 33.0 | 39.213 |
| 33.0 | 39.535 |
| 33.0 | 40.042 |
| 33.0 | 40.303 |
| 33.0 | 40.539 |
| 33.0 | 40.735 |
| 33.0 | 40.886 |
| 33.0 | 41.668 |
| 33.0 | 41.777 |
| 33.0 | 41.88 |
| 36.0 | 38.549 |
| 36.0 | 39.121 |
| 36.0 | 39.444 |
| 36.0 | 39.938 |
| 36.0 | 40.175 |
| 36.0 | 40.378 |
| 36.0 | 40.609 |
| 36.0 | 40.774 |
| 36.0 | 41.172 |
| 36.0 | 41.669 |
| 36.0 | 41.768 |
| 3.0 | 41.801 |
| 3.0 | 42.354 |
| 3.0 | 42.436 |
| 3.0 | 42.552 |
| 3.0 | 42.621 |
| 3.0 | 42.728 |
| 3.0 | 42.77 |
| 3.0 | 42.775 |
| 3.0 | 42.787 |
| 3.0 | 42.795 |
| 3.0 | 42.808 |
| 6.0 | 40.906 |
| 6.0 | 41.915 |
| 6.0 | 42.115 |
| 6.0 | 42.474 |
| 6.0 | 42.911 |
| 6.0 | 43.038 |
| 6.0 | 43.108 |
| 6.0 | 43.135 |
| 6.0 | 43.232 |
| 6.0 | 43.234 |
| 6.0 | 43.263 |
| 9.0 | 40.328 |
| 9.0 | 41.101 |
| 9.0 | 42.068 |
| 9.0 | 42.249 |
| 9.0 | 42.949 |
| 9.0 | 43.106 |
| 9.0 | 43.185 |
| 9.0 | 43.562 |
| 9.0 | 43.586 |
| 9.0 | 43.605 |
| 9.0 | 43.642 |
| 12.0 | 39.941 |
| 12.0 | 40.753 |
| 12.0 | 41.462 |
| 12.0 | 41.677 |
| 12.0 | 42.167 |
| 12.0 | 42.342 |
| 12.0 | 42.757 |
| 12.0 | 43.111 |
| 12.0 | 43.162 |
| 12.0 | 43.198 |
| 12.0 | 43.394 |
| 15.0 | 39.65 |
| 15.0 | 40.148 |
| 15.0 | 40.839 |
| 15.0 | 41.442 |
| 15.0 | 41.622 |
| 15.0 | 42.146 |
| 15.0 | 42.293 |
| 15.0 | 42.38 |
| 15.0 | 42.444 |
| 15.0 | 42.797 |
| 15.0 | 43.125 |
| 18.0 | 38.899 |
| 18.0 | 39.917 |
| 18.0 | 40.309 |
| 18.0 | 40.58 |
| 18.0 | 41.43 |
| 18.0 | 41.672 |
| 18.0 | 42.117 |
| 18.0 | 42.224 |
| 18.0 | 42.318 |
| 18.0 | 42.386 |
| 18.0 | 42.724 |
| 21.0 | 38.765 |
| 21.0 | 39.422 |
| 21.0 | 40.091 |
| 21.0 | 40.396 |
| 21.0 | 41.26 |
| 21.0 | 41.501 |
| 21.0 | 41.674 |
| 21.0 | 41.763 |
| 21.0 | 42.188 |
| 21.0 | 42.245 |
| 21.0 | 42.305 |
| 24.0 | 38.645 |
| 24.0 | 39.293 |
| 24.0 | 39.917 |
| 24.0 | 40.198 |
| 24.0 | 40.439 |
| 24.0 | 40.975 |
| 24.0 | 41.526 |
| 24.0 | 41.643 |
| 24.0 | 41.741 |
| 24.0 | 42.145 |
| 24.0 | 42.203 |
| 27.0 | 38.536 |
| 27.0 | 39.144 |
| 27.0 | 39.745 |
| 27.0 | 40.015 |
| 27.0 | 40.269 |
| 27.0 | 40.518 |
| 27.0 | 41.001 |
| 27.0 | 41.51 |
| 27.0 | 41.613 |
| 27.0 | 41.708 |
| 27.0 | 42.104 |
| 30.0 | 38.405 |
| 30.0 | 39.026 |
| 30.0 | 39.341 |
| 30.0 | 39.889 |
| 30.0 | 40.107 |
| 30.0 | 40.392 |
| 30.0 | 40.578 |
| 30.0 | 41.371 |
| 30.0 | 41.492 |
| 30.0 | 41.584 |
| 30.0 | 41.676 |
| 33.0 | 38.334 |
| 33.0 | 38.674 |
| 33.0 | 39.217 |
| 33.0 | 39.739 |
| 33.0 | 39.976 |
| 33.0 | 40.228 |
| 33.0 | 40.458 |
| 33.0 | 40.59 |
| 33.0 | 41.375 |
| 33.0 | 41.482 |
| 33.0 | 41.571 |
| 36.0 | 38.247 |
| 36.0 | 38.584 |
| 36.0 | 39.116 |
| 36.0 | 39.629 |
| 36.0 | 39.843 |
| 36.0 | 40.092 |
| 36.0 | 40.32 |
| 36.0 | 40.488 |
| 36.0 | 40.587 |
| 36.0 | 40.998 |
| 36.0 | 41.468 |